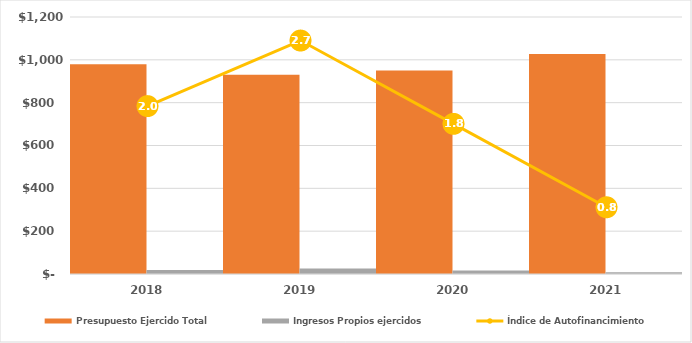
| Category | Presupuesto Ejercido Total | Ingresos Propios ejercidos |
|---|---|---|
| 2018.0 | 979910 | 19204 |
| 2019.0 | 930744.078 | 25363.348 |
| 2020.0 | 949931.095 | 16647.959 |
| 2021.0 | 1027496.009 | 8002.258 |